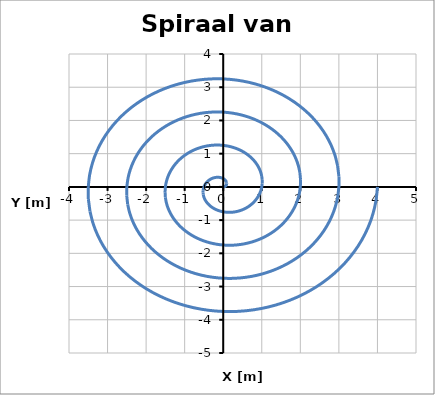
| Category | Positie |
|---|---|
| 0.0 | 0 |
| 0.016575364922804554 | 0.002 |
| 0.032604920024460186 | 0.007 |
| 0.04755282581475768 | 0.015 |
| 0.060903030509506725 | 0.027 |
| 0.07216878364870322 | 0.042 |
| 0.08090169943749476 | 0.059 |
| 0.08670022963902935 | 0.078 |
| 0.08921741418118109 | 0.099 |
| 0.08816778784387097 | 0.121 |
| 0.08333333333333334 | 0.144 |
| 0.07456838456389674 | 0.167 |
| 0.06180339887498949 | 0.19 |
| 0.04504753301051455 | 0.212 |
| 0.024389974762452526 | 0.232 |
| 1.531435568635775e-17 | 0.25 |
| -0.027874256871374223 | 0.265 |
| -0.05890831239836508 | 0.277 |
| -0.0927050983124842 | 0.285 |
| -0.12879993697400335 | 0.289 |
| -0.16666666666666657 | 0.289 |
| -0.20572483830236554 | 0.283 |
| -0.2453478889982479 | 0.272 |
| -0.28487218309966766 | 0.257 |
| -0.32360679774997897 | 0.235 |
| -0.360843918243516 | 0.208 |
| -0.3958696983117937 | 0.176 |
| -0.4279754323328191 | 0.139 |
| -0.4564688803424426 | 0.097 |
| -0.4806855827613321 | 0.051 |
| -0.5 | 0 |
| -0.5138363126069412 | -0.054 |
| -0.521678720391363 | -0.111 |
| -0.5230810839623345 | -0.17 |
| -0.5176757593308072 | -0.23 |
| -0.5051814855409227 | -0.292 |
| -0.48541019662496854 | -0.353 |
| -0.4582726423777267 | -0.413 |
| -0.42378271736061035 | -0.471 |
| -0.38206041399010765 | -0.526 |
| -0.3333333333333336 | -0.577 |
| -0.27793670610179727 | -0.624 |
| -0.2163118960624633 | -0.666 |
| -0.1490033784193945 | -0.701 |
| -0.07665420639627976 | -0.729 |
| -1.3782920117721975e-16 | -0.75 |
| 0.08013848850520061 | -0.762 |
| 0.1628641578072442 | -0.766 |
| 0.2472135954999578 | -0.761 |
| 0.3321682585119031 | -0.746 |
| 0.41666666666666613 | -0.722 |
| 0.49961746444860194 | -0.688 |
| 0.5799131921776768 | -0.644 |
| 0.6564445958383645 | -0.591 |
| 0.7281152949374526 | -0.529 |
| 0.7938566201357351 | -0.458 |
| 0.8526424271330938 | -0.38 |
| 0.9035036904803958 | -0.294 |
| 0.9455426807093454 | -0.201 |
| 0.9779465304454686 | -0.103 |
| 1.0 | 0 |
| 1.011097260291078 | 0.106 |
| 1.010752520758266 | 0.215 |
| 0.9986093421099114 | 0.324 |
| 0.9744484881521078 | 0.434 |
| 0.9381941874331422 | 0.542 |
| 0.8899186938124424 | 0.647 |
| 0.8298450551164239 | 0.747 |
| 0.75834802054004 | 0.842 |
| 0.6759530401363443 | 0.93 |
| 0.583333333333334 | 1.01 |
| 0.4813050276396979 | 1.081 |
| 0.37082039324993726 | 1.141 |
| 0.25295922382827457 | 1.19 |
| 0.12891843803010705 | 1.227 |
| 3.8285889215894375e-16 | 1.25 |
| -0.13240272013902696 | 1.26 |
| -0.2668200032161233 | 1.255 |
| -0.40172209268743125 | 1.236 |
| -0.5355365800498018 | 1.203 |
| -0.6666666666666656 | 1.155 |
| -0.7935100905948385 | 1.092 |
| -0.9144784953571048 | 1.016 |
| -1.028017008577061 | 0.926 |
| -1.132623792124926 | 0.823 |
| -1.2268693220279538 | 0.708 |
| -1.309415155954394 | 0.583 |
| -1.3790319486279725 | 0.448 |
| -1.4346164810762478 | 0.305 |
| -1.4752074781296054 | 0.155 |
| -1.5 | 0 |
| -1.5083582079752147 | -0.159 |
| -1.4998263211251688 | -0.319 |
| -1.4741376002574882 | -0.479 |
| -1.431221216973409 | -0.637 |
| -1.371206889325362 | -0.792 |
| -1.2944271909999163 | -0.94 |
| -1.2014174678551224 | -1.082 |
| -1.0929133237194695 | -1.214 |
| -0.9698456662825812 | -1.335 |
| -0.8333333333333356 | -1.443 |
| -0.6846733491775986 | -1.538 |
| -0.5253288904374113 | -1.617 |
| -0.35691506923715616 | -1.679 |
| -0.18118266966393445 | -1.724 |
| -7.504034286315298e-16 | -1.75 |
| 0.1846669517728516 | -1.757 |
| 0.37077584862500235 | -1.744 |
| 0.5562305898749046 | -1.712 |
| 0.738904901587701 | -1.66 |
| 0.916666666666665 | -1.588 |
| 1.0874027167410747 | -1.497 |
| 1.249043798536533 | -1.387 |
| 1.3995894213157578 | -1.26 |
| 1.5371322893123995 | -1.117 |
| 1.6598820239201726 | -0.958 |
| 1.7661878847756942 | -0.786 |
| 1.8545602067755491 | -0.603 |
| 1.9236902814431502 | -0.409 |
| 1.972468425813742 | -0.207 |
| 2.0 | 0 |
| 2.0056191556593514 | 0.211 |
| 1.9889001214920718 | 0.423 |
| 1.949665858405065 | 0.633 |
| 1.8879939457947097 | 0.841 |
| 1.8042195912175818 | 1.042 |
| 1.6989356881873903 | 1.234 |
| 1.5729898805938203 | 1.416 |
| 1.4274786268988993 | 1.585 |
| 1.263738292428818 | 1.739 |
| 1.0833333333333364 | 1.876 |
| 0.8880416707154993 | 1.995 |
| 0.6798373876248855 | 2.092 |
| 0.46087091464603697 | 2.168 |
| 0.23344690129776197 | 2.221 |
| 1.2404628105949778e-15 | 2.25 |
| -0.23693118340667726 | 2.254 |
| -0.4747316940338812 | 2.233 |
| -0.7107390870623778 | 2.187 |
| -0.9422732231256 | 2.116 |
| -1.1666666666666643 | 2.021 |
| -1.381295342887311 | 1.901 |
| -1.5836091017159613 | 1.759 |
| -1.7711618340544544 | 1.595 |
| -1.941640786499873 | 1.411 |
| -2.092894725812391 | 1.208 |
| -2.222960613596994 | 0.99 |
| -2.330088464923126 | 0.757 |
| -2.412764081810053 | 0.513 |
| -2.4697293734978785 | 0.26 |
| -2.5 | 0 |
| -2.502880103343488 | -0.263 |
| -2.477973921858975 | -0.527 |
| -2.4251941165526434 | -0.788 |
| -2.3447666746160105 | -1.044 |
| -2.2372322931098014 | -1.292 |
| -2.1034441853748644 | -1.528 |
| -1.944562293332515 | -1.751 |
| -1.7620439300783326 | -1.957 |
| -1.557630918575059 | -2.144 |
| -1.3333333333333375 | -2.309 |
| -1.0914099922534002 | -2.451 |
| -0.8343458848123598 | -2.568 |
| -0.5648267600549131 | -2.657 |
| -0.28571113293159445 | -2.718 |
| -6.7380183463999765e-15 | -2.75 |
| 0.28919541504050283 | -2.752 |
| 0.57868753944276 | -2.723 |
| 0.8652475842498509 | -2.663 |
| 1.1456415446635035 | -2.573 |
| 1.4166666666666592 | -2.454 |
| 1.6751879690335427 | -2.306 |
| 1.9181744048953895 | -2.13 |
| 2.1427342467931507 | -1.929 |
| 2.346149283687346 | -1.705 |
| 2.5259074277046123 | -1.458 |
| 2.679733342418292 | -1.193 |
| 2.8056167230707008 | -0.912 |
| 2.9018378821769555 | -0.617 |
| 2.9669903211820152 | -0.312 |
| 3.0 | 0 |
| 3.0001410510276245 | 0.315 |
| 2.9670477222258786 | 0.631 |
| 2.9007223747002207 | 0.943 |
| 2.8015394034373116 | 1.247 |
| 2.6702449950020215 | 1.542 |
| 2.5079526825623386 | 1.822 |
| 2.3161347060712125 | 2.085 |
| 2.0966092332577633 | 2.329 |
| 1.8515235447212965 | 2.548 |
| 1.5833333333333386 | 2.742 |
| 1.2947783137913014 | 2.908 |
| 0.9888543819998342 | 3.043 |
| 0.6687826054637932 | 3.146 |
| 0.3379753645654231 | 3.216 |
| 8.361285839045274e-15 | 3.25 |
| -0.3414596466743282 | 3.249 |
| -0.6826433848516387 | 3.212 |
| -1.0197560814373239 | 3.138 |
| -1.3490098662014032 | 3.03 |
| -1.6666666666666574 | 2.887 |
| -1.969080595179778 | 2.71 |
| -2.2527397080748175 | 2.502 |
| -2.5143066595318473 | 2.264 |
| -2.7506577808748194 | 1.998 |
| -2.9589201295968315 | 1.708 |
| -3.136506071239592 | 1.396 |
| -3.2811449812182767 | 1.066 |
| -3.3909116825438583 | 0.721 |
| -3.4642512688661515 | 0.364 |
| -3.5 | 0 |
| -3.4974019987117613 | -0.368 |
| -3.4561215225927824 | -0.735 |
| -3.376250632847798 | -1.097 |
| -3.2583121322586126 | -1.451 |
| -3.103257696894241 | -1.792 |
| -2.9124611797498123 | -2.116 |
| -2.68770711880991 | -2.42 |
| -2.4311745364371937 | -2.7 |
| -2.1454161708675348 | -2.953 |
| -1.8333333333333397 | -3.175 |
| -1.4981466353292026 | -3.365 |
| -1.1433628791873085 | -3.519 |
| -0.7727384508726733 | -3.635 |
| -0.3902395961992518 | -3.713 |
| -1.0107068177181433e-14 | -3.75 |
| 0.39372387830815353 | -3.746 |
| 0.7865992302605171 | -3.701 |
| 1.174264578624797 | -3.614 |
| 1.5523781877393028 | -3.487 |
| 1.9166666666666556 | -3.32 |
| 2.262973221326013 | -3.115 |
| 2.5873050112542457 | -2.873 |
| 2.885879072270544 | -2.598 |
| 3.1551662780622927 | -2.292 |
| 3.3919328314890507 | -1.958 |
| 3.5932788000608915 | -1.6 |
| 3.756673239365853 | -1.221 |
| 3.8799854829107607 | -0.825 |
| 3.9615122165502883 | -0.416 |
| 4.0 | 0 |